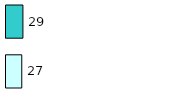
| Category | Series 0 | Series 1 |
|---|---|---|
| 0 | 27 | 29 |